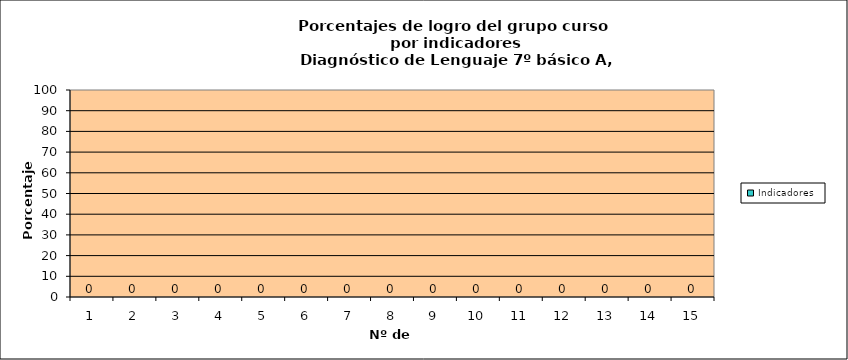
| Category | Indicadores |
|---|---|
| 0 | 0 |
| 1 | 0 |
| 2 | 0 |
| 3 | 0 |
| 4 | 0 |
| 5 | 0 |
| 6 | 0 |
| 7 | 0 |
| 8 | 0 |
| 9 | 0 |
| 10 | 0 |
| 11 | 0 |
| 12 | 0 |
| 13 | 0 |
| 14 | 0 |